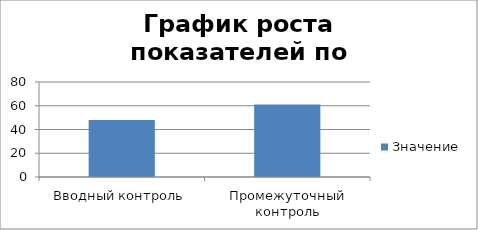
| Category | Значение |
|---|---|
| Вводный контроль | 48 |
| Промежуточный контроль | 61 |